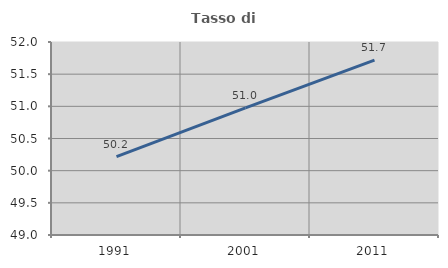
| Category | Tasso di occupazione   |
|---|---|
| 1991.0 | 50.22 |
| 2001.0 | 50.977 |
| 2011.0 | 51.719 |